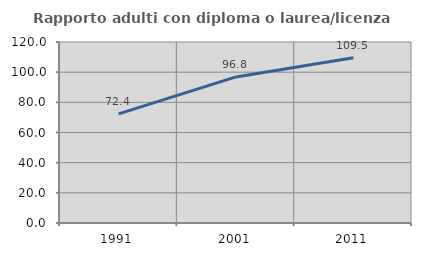
| Category | Rapporto adulti con diploma o laurea/licenza media  |
|---|---|
| 1991.0 | 72.368 |
| 2001.0 | 96.842 |
| 2011.0 | 109.547 |